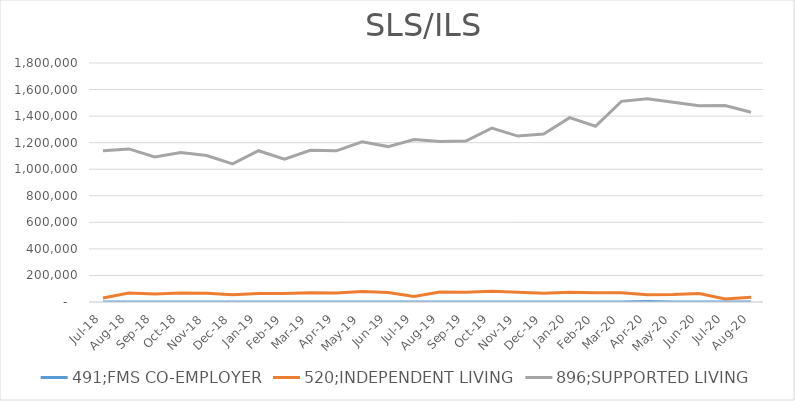
| Category | 491;FMS CO-EMPLOYER | 520;INDEPENDENT LIVING | 896;SUPPORTED LIVING |
|---|---|---|---|
| Jul-18 | 0 | 29615.23 | 1138414.84 |
| Aug-18 | 0 | 68410.92 | 1152838.74 |
| Sep-18 | 0 | 61161.08 | 1092500.68 |
| Oct-18 | 0 | 67931.72 | 1126699.05 |
| Nov-18 | 0 | 66322.46 | 1103587.74 |
| Dec-18 | 0 | 55141.29 | 1040118.47 |
| Jan-19 | 0 | 64902.66 | 1139415.82 |
| Feb-19 | 0 | 64826.83 | 1075471.98 |
| Mar-19 | 0 | 69860.46 | 1142642.99 |
| Apr-19 | 0 | 68434.11 | 1138501.67 |
| May-19 | 0 | 79557.2 | 1206058.83 |
| Jun-19 | 0 | 71309.22 | 1170459.92 |
| Jul-19 | 0 | 42469.41 | 1224241.94 |
| Aug-19 | 0 | 75963.77 | 1208564.41 |
| Sep-19 | 0 | 73635.21 | 1212302.29 |
| Oct-19 | 0 | 81097.38 | 1309757.18 |
| Nov-19 | 0 | 73893.04 | 1249430.9 |
| Dec-19 | 0 | 66328.53 | 1264434.49 |
| Jan-20 | 0 | 73498.76 | 1388135.83 |
| Feb-20 | 0 | 69488.11 | 1323465.04 |
| Mar-20 | 0 | 69691.44 | 1511019.18 |
| Apr-20 | 3927.26 | 54555.68 | 1529902.09 |
| May-20 | 0 | 57181.59 | 1504331.52 |
| Jun-20 | 0 | 64275.05 | 1478786.88 |
| Jul-20 | 0 | 23105.18 | 1479072.15 |
| Aug-20 | 0 | 34917.64 | 1429423.16 |